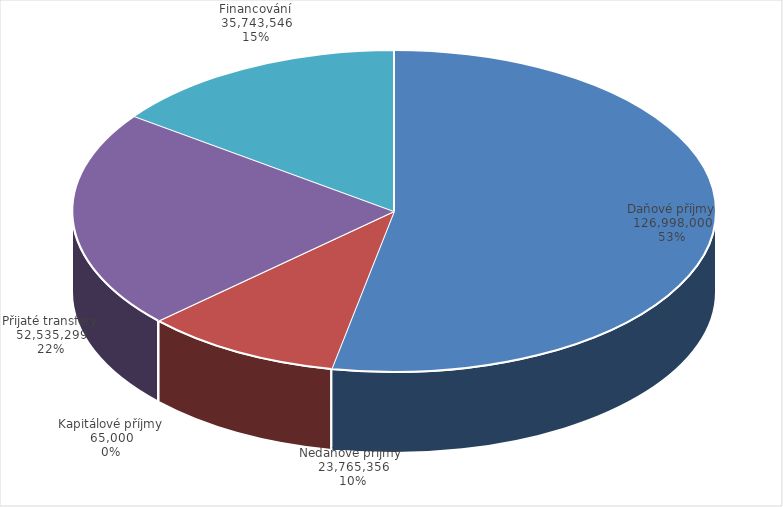
| Category | Series 0 |
|---|---|
| Daňové příjmy | 126998000 |
| Nedaňové příjmy  | 23765356 |
| Kapitálové příjmy | 65000 |
| Přijaté transfery | 52535299 |
| Financování | 35743546 |